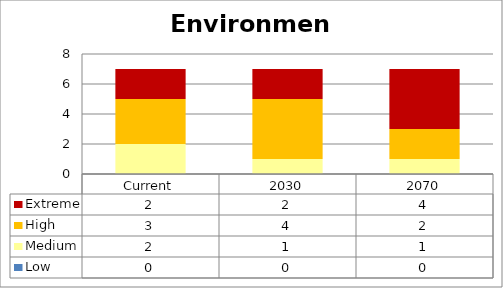
| Category | Low | Medium | High | Extreme |
|---|---|---|---|---|
| Current | 0 | 2 | 3 | 2 |
| 2030 | 0 | 1 | 4 | 2 |
| 2070 | 0 | 1 | 2 | 4 |